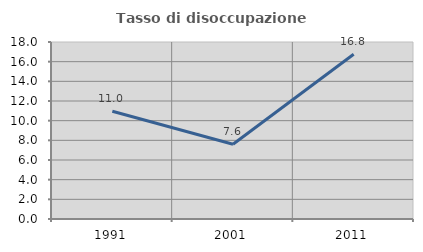
| Category | Tasso di disoccupazione giovanile  |
|---|---|
| 1991.0 | 10.961 |
| 2001.0 | 7.607 |
| 2011.0 | 16.76 |